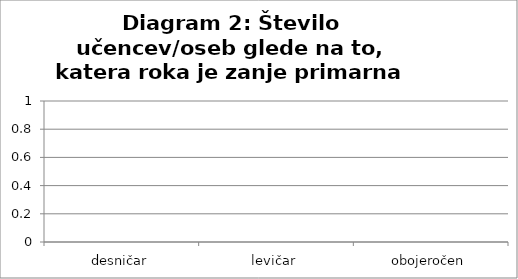
| Category | Skupaj |
|---|---|
| desničar | 0 |
| levičar | 0 |
| obojeročen | 0 |